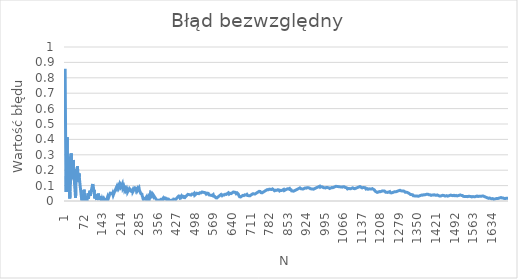
| Category | Błąd bezwzględny |
|---|---|
| 1.0 | 0.858 |
| 2.0 | 0.858 |
| 3.0 | 0.858 |
| 4.0 | 0.142 |
| 5.0 | 0.058 |
| 6.0 | 0.192 |
| 7.0 | 0.287 |
| 8.0 | 0.358 |
| 9.0 | 0.414 |
| 10.0 | 0.058 |
| 11.0 | 0.131 |
| 12.0 | 0.192 |
| 13.0 | 0.243 |
| 14.0 | 0.287 |
| 15.0 | 0.058 |
| 16.0 | 0.142 |
| 17.0 | 0.083 |
| 18.0 | 0.03 |
| 19.0 | 0.016 |
| 20.0 | 0.058 |
| 21.0 | 0.094 |
| 22.0 | 0.233 |
| 23.0 | 0.185 |
| 24.0 | 0.308 |
| 25.0 | 0.262 |
| 26.0 | 0.219 |
| 27.0 | 0.179 |
| 28.0 | 0.142 |
| 29.0 | 0.245 |
| 30.0 | 0.208 |
| 31.0 | 0.174 |
| 32.0 | 0.267 |
| 33.0 | 0.233 |
| 34.0 | 0.2 |
| 35.0 | 0.17 |
| 36.0 | 0.142 |
| 37.0 | 0.115 |
| 38.0 | 0.089 |
| 39.0 | 0.065 |
| 40.0 | 0.042 |
| 41.0 | 0.02 |
| 42.0 | 0.094 |
| 43.0 | 0.165 |
| 44.0 | 0.142 |
| 45.0 | 0.208 |
| 46.0 | 0.185 |
| 47.0 | 0.163 |
| 48.0 | 0.225 |
| 49.0 | 0.203 |
| 50.0 | 0.182 |
| 51.0 | 0.161 |
| 52.0 | 0.142 |
| 53.0 | 0.123 |
| 54.0 | 0.179 |
| 55.0 | 0.16 |
| 56.0 | 0.142 |
| 57.0 | 0.124 |
| 58.0 | 0.107 |
| 59.0 | 0.091 |
| 60.0 | 0.075 |
| 61.0 | 0.06 |
| 62.0 | 0.045 |
| 63.0 | 0.03 |
| 64.0 | 0.017 |
| 65.0 | 0.003 |
| 66.0 | 0.01 |
| 67.0 | 0.023 |
| 68.0 | 0.024 |
| 69.0 | 0.011 |
| 70.0 | 0.001 |
| 71.0 | 0.043 |
| 72.0 | 0.03 |
| 73.0 | 0.073 |
| 74.0 | 0.061 |
| 75.0 | 0.048 |
| 76.0 | 0.036 |
| 77.0 | 0.025 |
| 78.0 | 0.013 |
| 79.0 | 0.002 |
| 80.0 | 0.008 |
| 81.0 | 0.03 |
| 82.0 | 0.02 |
| 83.0 | 0.009 |
| 84.0 | 0.001 |
| 85.0 | 0.011 |
| 86.0 | 0.021 |
| 87.0 | 0.031 |
| 88.0 | 0.04 |
| 89.0 | 0.049 |
| 90.0 | 0.014 |
| 91.0 | 0.023 |
| 92.0 | 0.032 |
| 93.0 | 0.041 |
| 94.0 | 0.05 |
| 95.0 | 0.058 |
| 96.0 | 0.067 |
| 97.0 | 0.034 |
| 98.0 | 0.042 |
| 99.0 | 0.05 |
| 100.0 | 0.058 |
| 101.0 | 0.066 |
| 102.0 | 0.074 |
| 103.0 | 0.082 |
| 104.0 | 0.089 |
| 105.0 | 0.097 |
| 106.0 | 0.104 |
| 107.0 | 0.111 |
| 108.0 | 0.081 |
| 109.0 | 0.088 |
| 110.0 | 0.058 |
| 111.0 | 0.066 |
| 112.0 | 0.073 |
| 113.0 | 0.044 |
| 114.0 | 0.016 |
| 115.0 | 0.024 |
| 116.0 | 0.031 |
| 117.0 | 0.038 |
| 118.0 | 0.045 |
| 119.0 | 0.018 |
| 120.0 | 0.025 |
| 121.0 | 0.032 |
| 122.0 | 0.006 |
| 123.0 | 0.013 |
| 124.0 | 0.013 |
| 125.0 | 0.038 |
| 126.0 | 0.03 |
| 127.0 | 0.023 |
| 128.0 | 0.048 |
| 129.0 | 0.041 |
| 130.0 | 0.034 |
| 131.0 | 0.027 |
| 132.0 | 0.02 |
| 133.0 | 0.014 |
| 134.0 | 0.007 |
| 135.0 | 0.03 |
| 136.0 | 0.024 |
| 137.0 | 0.018 |
| 138.0 | 0.011 |
| 139.0 | 0.005 |
| 140.0 | 0.001 |
| 141.0 | 0.007 |
| 142.0 | 0.013 |
| 143.0 | 0.009 |
| 144.0 | 0.003 |
| 145.0 | 0.003 |
| 146.0 | 0.009 |
| 147.0 | 0.012 |
| 148.0 | 0.006 |
| 149.0 | 0.001 |
| 150.0 | 0.005 |
| 151.0 | 0.011 |
| 152.0 | 0.016 |
| 153.0 | 0.004 |
| 154.0 | 0.001 |
| 155.0 | 0.019 |
| 156.0 | 0.013 |
| 157.0 | 0.008 |
| 158.0 | 0.002 |
| 159.0 | 0.003 |
| 160.0 | 0.008 |
| 161.0 | 0.014 |
| 162.0 | 0.019 |
| 163.0 | 0.024 |
| 164.0 | 0.029 |
| 165.0 | 0.01 |
| 166.0 | 0.015 |
| 167.0 | 0.02 |
| 168.0 | 0.025 |
| 169.0 | 0.03 |
| 170.0 | 0.035 |
| 171.0 | 0.04 |
| 172.0 | 0.044 |
| 173.0 | 0.049 |
| 174.0 | 0.054 |
| 175.0 | 0.058 |
| 176.0 | 0.04 |
| 177.0 | 0.045 |
| 178.0 | 0.049 |
| 179.0 | 0.054 |
| 180.0 | 0.058 |
| 181.0 | 0.041 |
| 182.0 | 0.045 |
| 183.0 | 0.05 |
| 184.0 | 0.054 |
| 185.0 | 0.037 |
| 186.0 | 0.041 |
| 187.0 | 0.046 |
| 188.0 | 0.05 |
| 189.0 | 0.054 |
| 190.0 | 0.058 |
| 191.0 | 0.063 |
| 192.0 | 0.067 |
| 193.0 | 0.071 |
| 194.0 | 0.075 |
| 195.0 | 0.079 |
| 196.0 | 0.083 |
| 197.0 | 0.087 |
| 198.0 | 0.091 |
| 199.0 | 0.095 |
| 200.0 | 0.098 |
| 201.0 | 0.082 |
| 202.0 | 0.086 |
| 203.0 | 0.09 |
| 204.0 | 0.094 |
| 205.0 | 0.097 |
| 206.0 | 0.101 |
| 207.0 | 0.105 |
| 208.0 | 0.089 |
| 209.0 | 0.093 |
| 210.0 | 0.097 |
| 211.0 | 0.1 |
| 212.0 | 0.104 |
| 213.0 | 0.107 |
| 214.0 | 0.092 |
| 215.0 | 0.096 |
| 216.0 | 0.099 |
| 217.0 | 0.103 |
| 218.0 | 0.106 |
| 219.0 | 0.11 |
| 220.0 | 0.113 |
| 221.0 | 0.098 |
| 222.0 | 0.084 |
| 223.0 | 0.087 |
| 224.0 | 0.091 |
| 225.0 | 0.094 |
| 226.0 | 0.097 |
| 227.0 | 0.101 |
| 228.0 | 0.086 |
| 229.0 | 0.072 |
| 230.0 | 0.076 |
| 231.0 | 0.079 |
| 232.0 | 0.083 |
| 233.0 | 0.069 |
| 234.0 | 0.072 |
| 235.0 | 0.075 |
| 236.0 | 0.079 |
| 237.0 | 0.082 |
| 238.0 | 0.085 |
| 239.0 | 0.072 |
| 240.0 | 0.058 |
| 241.0 | 0.062 |
| 242.0 | 0.065 |
| 243.0 | 0.068 |
| 244.0 | 0.072 |
| 245.0 | 0.075 |
| 246.0 | 0.078 |
| 247.0 | 0.081 |
| 248.0 | 0.084 |
| 249.0 | 0.087 |
| 250.0 | 0.074 |
| 251.0 | 0.078 |
| 252.0 | 0.065 |
| 253.0 | 0.068 |
| 254.0 | 0.071 |
| 255.0 | 0.058 |
| 256.0 | 0.062 |
| 257.0 | 0.065 |
| 258.0 | 0.068 |
| 259.0 | 0.071 |
| 260.0 | 0.058 |
| 261.0 | 0.061 |
| 262.0 | 0.065 |
| 263.0 | 0.068 |
| 264.0 | 0.071 |
| 265.0 | 0.074 |
| 266.0 | 0.076 |
| 267.0 | 0.079 |
| 268.0 | 0.082 |
| 269.0 | 0.085 |
| 270.0 | 0.088 |
| 271.0 | 0.091 |
| 272.0 | 0.079 |
| 273.0 | 0.082 |
| 274.0 | 0.07 |
| 275.0 | 0.073 |
| 276.0 | 0.076 |
| 277.0 | 0.079 |
| 278.0 | 0.067 |
| 279.0 | 0.07 |
| 280.0 | 0.073 |
| 281.0 | 0.075 |
| 282.0 | 0.078 |
| 283.0 | 0.081 |
| 284.0 | 0.084 |
| 285.0 | 0.072 |
| 286.0 | 0.075 |
| 287.0 | 0.078 |
| 288.0 | 0.067 |
| 289.0 | 0.056 |
| 290.0 | 0.058 |
| 291.0 | 0.047 |
| 292.0 | 0.05 |
| 293.0 | 0.053 |
| 294.0 | 0.042 |
| 295.0 | 0.045 |
| 296.0 | 0.034 |
| 297.0 | 0.037 |
| 298.0 | 0.026 |
| 299.0 | 0.016 |
| 300.0 | 0.018 |
| 301.0 | 0.008 |
| 302.0 | 0.011 |
| 303.0 | 0.014 |
| 304.0 | 0.016 |
| 305.0 | 0.019 |
| 306.0 | 0.022 |
| 307.0 | 0.012 |
| 308.0 | 0.014 |
| 309.0 | 0.017 |
| 310.0 | 0.02 |
| 311.0 | 0.022 |
| 312.0 | 0.012 |
| 313.0 | 0.015 |
| 314.0 | 0.018 |
| 315.0 | 0.02 |
| 316.0 | 0.01 |
| 317.0 | 0.013 |
| 318.0 | 0.003 |
| 319.0 | 0.007 |
| 320.0 | 0.017 |
| 321.0 | 0.026 |
| 322.0 | 0.024 |
| 323.0 | 0.021 |
| 324.0 | 0.018 |
| 325.0 | 0.028 |
| 326.0 | 0.037 |
| 327.0 | 0.047 |
| 328.0 | 0.044 |
| 329.0 | 0.041 |
| 330.0 | 0.039 |
| 331.0 | 0.048 |
| 332.0 | 0.045 |
| 333.0 | 0.042 |
| 334.0 | 0.04 |
| 335.0 | 0.037 |
| 336.0 | 0.034 |
| 337.0 | 0.032 |
| 338.0 | 0.041 |
| 339.0 | 0.038 |
| 340.0 | 0.036 |
| 341.0 | 0.033 |
| 342.0 | 0.03 |
| 343.0 | 0.028 |
| 344.0 | 0.025 |
| 345.0 | 0.023 |
| 346.0 | 0.02 |
| 347.0 | 0.018 |
| 348.0 | 0.015 |
| 349.0 | 0.013 |
| 350.0 | 0.01 |
| 351.0 | 0.008 |
| 352.0 | 0.005 |
| 353.0 | 0.003 |
| 354.0 | 0 |
| 355.0 | 0.009 |
| 356.0 | 0.007 |
| 357.0 | 0.004 |
| 358.0 | 0.002 |
| 359.0 | 0.011 |
| 360.0 | 0.008 |
| 361.0 | 0.006 |
| 362.0 | 0.003 |
| 363.0 | 0.001 |
| 364.0 | 0.001 |
| 365.0 | 0.004 |
| 366.0 | 0.006 |
| 367.0 | 0.008 |
| 368.0 | 0.011 |
| 369.0 | 0.013 |
| 370.0 | 0.015 |
| 371.0 | 0.007 |
| 372.0 | 0.009 |
| 373.0 | 0.011 |
| 374.0 | 0.013 |
| 375.0 | 0.016 |
| 376.0 | 0.007 |
| 377.0 | 0.01 |
| 378.0 | 0.012 |
| 379.0 | 0.014 |
| 380.0 | 0.016 |
| 381.0 | 0.019 |
| 382.0 | 0.021 |
| 383.0 | 0.023 |
| 384.0 | 0.015 |
| 385.0 | 0.017 |
| 386.0 | 0.019 |
| 387.0 | 0.021 |
| 388.0 | 0.013 |
| 389.0 | 0.015 |
| 390.0 | 0.007 |
| 391.0 | 0.009 |
| 392.0 | 0.011 |
| 393.0 | 0.014 |
| 394.0 | 0.016 |
| 395.0 | 0.018 |
| 396.0 | 0.02 |
| 397.0 | 0.012 |
| 398.0 | 0.014 |
| 399.0 | 0.006 |
| 400.0 | 0.002 |
| 401.0 | 0.001 |
| 402.0 | 0.007 |
| 403.0 | 0.005 |
| 404.0 | 0.003 |
| 405.0 | 0.001 |
| 406.0 | 0.001 |
| 407.0 | 0.003 |
| 408.0 | 0.005 |
| 409.0 | 0.008 |
| 410.0 | 0.01 |
| 411.0 | 0.012 |
| 412.0 | 0.004 |
| 413.0 | 0.006 |
| 414.0 | 0.008 |
| 415.0 | 0.01 |
| 416.0 | 0.012 |
| 417.0 | 0.014 |
| 418.0 | 0.007 |
| 419.0 | 0.009 |
| 420.0 | 0.011 |
| 421.0 | 0.013 |
| 422.0 | 0.015 |
| 423.0 | 0.017 |
| 424.0 | 0.009 |
| 425.0 | 0.011 |
| 426.0 | 0.013 |
| 427.0 | 0.015 |
| 428.0 | 0.017 |
| 429.0 | 0.019 |
| 430.0 | 0.021 |
| 431.0 | 0.023 |
| 432.0 | 0.025 |
| 433.0 | 0.027 |
| 434.0 | 0.029 |
| 435.0 | 0.031 |
| 436.0 | 0.033 |
| 437.0 | 0.035 |
| 438.0 | 0.036 |
| 439.0 | 0.029 |
| 440.0 | 0.031 |
| 441.0 | 0.024 |
| 442.0 | 0.026 |
| 443.0 | 0.028 |
| 444.0 | 0.03 |
| 445.0 | 0.031 |
| 446.0 | 0.024 |
| 447.0 | 0.026 |
| 448.0 | 0.028 |
| 449.0 | 0.03 |
| 450.0 | 0.032 |
| 451.0 | 0.034 |
| 452.0 | 0.035 |
| 453.0 | 0.037 |
| 454.0 | 0.03 |
| 455.0 | 0.023 |
| 456.0 | 0.025 |
| 457.0 | 0.027 |
| 458.0 | 0.029 |
| 459.0 | 0.022 |
| 460.0 | 0.024 |
| 461.0 | 0.025 |
| 462.0 | 0.027 |
| 463.0 | 0.029 |
| 464.0 | 0.031 |
| 465.0 | 0.033 |
| 466.0 | 0.034 |
| 467.0 | 0.036 |
| 468.0 | 0.038 |
| 469.0 | 0.04 |
| 470.0 | 0.041 |
| 471.0 | 0.043 |
| 472.0 | 0.045 |
| 473.0 | 0.047 |
| 474.0 | 0.048 |
| 475.0 | 0.042 |
| 476.0 | 0.043 |
| 477.0 | 0.037 |
| 478.0 | 0.038 |
| 479.0 | 0.04 |
| 480.0 | 0.042 |
| 481.0 | 0.035 |
| 482.0 | 0.037 |
| 483.0 | 0.039 |
| 484.0 | 0.04 |
| 485.0 | 0.042 |
| 486.0 | 0.044 |
| 487.0 | 0.045 |
| 488.0 | 0.047 |
| 489.0 | 0.04 |
| 490.0 | 0.042 |
| 491.0 | 0.044 |
| 492.0 | 0.045 |
| 493.0 | 0.047 |
| 494.0 | 0.049 |
| 495.0 | 0.05 |
| 496.0 | 0.044 |
| 497.0 | 0.037 |
| 498.0 | 0.039 |
| 499.0 | 0.041 |
| 500.0 | 0.042 |
| 501.0 | 0.044 |
| 502.0 | 0.046 |
| 503.0 | 0.047 |
| 504.0 | 0.049 |
| 505.0 | 0.05 |
| 506.0 | 0.052 |
| 507.0 | 0.054 |
| 508.0 | 0.055 |
| 509.0 | 0.049 |
| 510.0 | 0.051 |
| 511.0 | 0.052 |
| 512.0 | 0.046 |
| 513.0 | 0.047 |
| 514.0 | 0.049 |
| 515.0 | 0.051 |
| 516.0 | 0.052 |
| 517.0 | 0.054 |
| 518.0 | 0.055 |
| 519.0 | 0.049 |
| 520.0 | 0.051 |
| 521.0 | 0.052 |
| 522.0 | 0.054 |
| 523.0 | 0.055 |
| 524.0 | 0.057 |
| 525.0 | 0.058 |
| 526.0 | 0.06 |
| 527.0 | 0.061 |
| 528.0 | 0.055 |
| 529.0 | 0.057 |
| 530.0 | 0.058 |
| 531.0 | 0.06 |
| 532.0 | 0.061 |
| 533.0 | 0.055 |
| 534.0 | 0.049 |
| 535.0 | 0.051 |
| 536.0 | 0.052 |
| 537.0 | 0.054 |
| 538.0 | 0.048 |
| 539.0 | 0.05 |
| 540.0 | 0.051 |
| 541.0 | 0.045 |
| 542.0 | 0.047 |
| 543.0 | 0.048 |
| 544.0 | 0.05 |
| 545.0 | 0.051 |
| 546.0 | 0.053 |
| 547.0 | 0.047 |
| 548.0 | 0.048 |
| 549.0 | 0.05 |
| 550.0 | 0.044 |
| 551.0 | 0.045 |
| 552.0 | 0.04 |
| 553.0 | 0.041 |
| 554.0 | 0.035 |
| 555.0 | 0.037 |
| 556.0 | 0.038 |
| 557.0 | 0.033 |
| 558.0 | 0.034 |
| 559.0 | 0.036 |
| 560.0 | 0.037 |
| 561.0 | 0.038 |
| 562.0 | 0.04 |
| 563.0 | 0.034 |
| 564.0 | 0.036 |
| 565.0 | 0.037 |
| 566.0 | 0.039 |
| 567.0 | 0.04 |
| 568.0 | 0.042 |
| 569.0 | 0.036 |
| 570.0 | 0.03 |
| 571.0 | 0.025 |
| 572.0 | 0.026 |
| 573.0 | 0.028 |
| 574.0 | 0.029 |
| 575.0 | 0.024 |
| 576.0 | 0.025 |
| 577.0 | 0.027 |
| 578.0 | 0.021 |
| 579.0 | 0.022 |
| 580.0 | 0.017 |
| 581.0 | 0.018 |
| 582.0 | 0.02 |
| 583.0 | 0.021 |
| 584.0 | 0.023 |
| 585.0 | 0.024 |
| 586.0 | 0.026 |
| 587.0 | 0.027 |
| 588.0 | 0.028 |
| 589.0 | 0.03 |
| 590.0 | 0.031 |
| 591.0 | 0.033 |
| 592.0 | 0.034 |
| 593.0 | 0.035 |
| 594.0 | 0.037 |
| 595.0 | 0.038 |
| 596.0 | 0.04 |
| 597.0 | 0.041 |
| 598.0 | 0.042 |
| 599.0 | 0.044 |
| 600.0 | 0.038 |
| 601.0 | 0.04 |
| 602.0 | 0.034 |
| 603.0 | 0.036 |
| 604.0 | 0.037 |
| 605.0 | 0.039 |
| 606.0 | 0.04 |
| 607.0 | 0.041 |
| 608.0 | 0.043 |
| 609.0 | 0.044 |
| 610.0 | 0.039 |
| 611.0 | 0.04 |
| 612.0 | 0.041 |
| 613.0 | 0.043 |
| 614.0 | 0.044 |
| 615.0 | 0.045 |
| 616.0 | 0.04 |
| 617.0 | 0.042 |
| 618.0 | 0.043 |
| 619.0 | 0.044 |
| 620.0 | 0.046 |
| 621.0 | 0.047 |
| 622.0 | 0.048 |
| 623.0 | 0.049 |
| 624.0 | 0.051 |
| 625.0 | 0.052 |
| 626.0 | 0.053 |
| 627.0 | 0.048 |
| 628.0 | 0.049 |
| 629.0 | 0.044 |
| 630.0 | 0.046 |
| 631.0 | 0.047 |
| 632.0 | 0.048 |
| 633.0 | 0.05 |
| 634.0 | 0.051 |
| 635.0 | 0.046 |
| 636.0 | 0.047 |
| 637.0 | 0.048 |
| 638.0 | 0.05 |
| 639.0 | 0.051 |
| 640.0 | 0.052 |
| 641.0 | 0.053 |
| 642.0 | 0.055 |
| 643.0 | 0.056 |
| 644.0 | 0.057 |
| 645.0 | 0.058 |
| 646.0 | 0.06 |
| 647.0 | 0.061 |
| 648.0 | 0.062 |
| 649.0 | 0.057 |
| 650.0 | 0.058 |
| 651.0 | 0.06 |
| 652.0 | 0.055 |
| 653.0 | 0.056 |
| 654.0 | 0.051 |
| 655.0 | 0.052 |
| 656.0 | 0.047 |
| 657.0 | 0.049 |
| 658.0 | 0.05 |
| 659.0 | 0.051 |
| 660.0 | 0.052 |
| 661.0 | 0.054 |
| 662.0 | 0.049 |
| 663.0 | 0.05 |
| 664.0 | 0.045 |
| 665.0 | 0.04 |
| 666.0 | 0.036 |
| 667.0 | 0.031 |
| 668.0 | 0.032 |
| 669.0 | 0.027 |
| 670.0 | 0.029 |
| 671.0 | 0.024 |
| 672.0 | 0.025 |
| 673.0 | 0.026 |
| 674.0 | 0.028 |
| 675.0 | 0.029 |
| 676.0 | 0.03 |
| 677.0 | 0.031 |
| 678.0 | 0.032 |
| 679.0 | 0.034 |
| 680.0 | 0.035 |
| 681.0 | 0.036 |
| 682.0 | 0.037 |
| 683.0 | 0.038 |
| 684.0 | 0.04 |
| 685.0 | 0.035 |
| 686.0 | 0.036 |
| 687.0 | 0.037 |
| 688.0 | 0.039 |
| 689.0 | 0.04 |
| 690.0 | 0.035 |
| 691.0 | 0.036 |
| 692.0 | 0.038 |
| 693.0 | 0.039 |
| 694.0 | 0.04 |
| 695.0 | 0.041 |
| 696.0 | 0.042 |
| 697.0 | 0.043 |
| 698.0 | 0.039 |
| 699.0 | 0.04 |
| 700.0 | 0.036 |
| 701.0 | 0.037 |
| 702.0 | 0.032 |
| 703.0 | 0.033 |
| 704.0 | 0.035 |
| 705.0 | 0.036 |
| 706.0 | 0.031 |
| 707.0 | 0.032 |
| 708.0 | 0.034 |
| 709.0 | 0.035 |
| 710.0 | 0.036 |
| 711.0 | 0.037 |
| 712.0 | 0.038 |
| 713.0 | 0.039 |
| 714.0 | 0.04 |
| 715.0 | 0.042 |
| 716.0 | 0.043 |
| 717.0 | 0.044 |
| 718.0 | 0.045 |
| 719.0 | 0.046 |
| 720.0 | 0.047 |
| 721.0 | 0.048 |
| 722.0 | 0.05 |
| 723.0 | 0.051 |
| 724.0 | 0.046 |
| 725.0 | 0.047 |
| 726.0 | 0.048 |
| 727.0 | 0.044 |
| 728.0 | 0.045 |
| 729.0 | 0.046 |
| 730.0 | 0.047 |
| 731.0 | 0.049 |
| 732.0 | 0.05 |
| 733.0 | 0.051 |
| 734.0 | 0.052 |
| 735.0 | 0.053 |
| 736.0 | 0.054 |
| 737.0 | 0.055 |
| 738.0 | 0.056 |
| 739.0 | 0.057 |
| 740.0 | 0.058 |
| 741.0 | 0.059 |
| 742.0 | 0.061 |
| 743.0 | 0.062 |
| 744.0 | 0.063 |
| 745.0 | 0.064 |
| 746.0 | 0.065 |
| 747.0 | 0.066 |
| 748.0 | 0.062 |
| 749.0 | 0.063 |
| 750.0 | 0.058 |
| 751.0 | 0.054 |
| 752.0 | 0.05 |
| 753.0 | 0.051 |
| 754.0 | 0.052 |
| 755.0 | 0.053 |
| 756.0 | 0.054 |
| 757.0 | 0.055 |
| 758.0 | 0.056 |
| 759.0 | 0.057 |
| 760.0 | 0.058 |
| 761.0 | 0.059 |
| 762.0 | 0.061 |
| 763.0 | 0.062 |
| 764.0 | 0.063 |
| 765.0 | 0.064 |
| 766.0 | 0.065 |
| 767.0 | 0.066 |
| 768.0 | 0.067 |
| 769.0 | 0.068 |
| 770.0 | 0.069 |
| 771.0 | 0.07 |
| 772.0 | 0.071 |
| 773.0 | 0.072 |
| 774.0 | 0.073 |
| 775.0 | 0.074 |
| 776.0 | 0.07 |
| 777.0 | 0.071 |
| 778.0 | 0.072 |
| 779.0 | 0.073 |
| 780.0 | 0.074 |
| 781.0 | 0.075 |
| 782.0 | 0.076 |
| 783.0 | 0.077 |
| 784.0 | 0.078 |
| 785.0 | 0.079 |
| 786.0 | 0.08 |
| 787.0 | 0.076 |
| 788.0 | 0.077 |
| 789.0 | 0.073 |
| 790.0 | 0.074 |
| 791.0 | 0.075 |
| 792.0 | 0.076 |
| 793.0 | 0.077 |
| 794.0 | 0.078 |
| 795.0 | 0.079 |
| 796.0 | 0.074 |
| 797.0 | 0.075 |
| 798.0 | 0.076 |
| 799.0 | 0.072 |
| 800.0 | 0.068 |
| 801.0 | 0.069 |
| 802.0 | 0.07 |
| 803.0 | 0.066 |
| 804.0 | 0.067 |
| 805.0 | 0.068 |
| 806.0 | 0.069 |
| 807.0 | 0.07 |
| 808.0 | 0.071 |
| 809.0 | 0.072 |
| 810.0 | 0.073 |
| 811.0 | 0.069 |
| 812.0 | 0.07 |
| 813.0 | 0.071 |
| 814.0 | 0.072 |
| 815.0 | 0.073 |
| 816.0 | 0.069 |
| 817.0 | 0.07 |
| 818.0 | 0.071 |
| 819.0 | 0.072 |
| 820.0 | 0.073 |
| 821.0 | 0.069 |
| 822.0 | 0.065 |
| 823.0 | 0.066 |
| 824.0 | 0.067 |
| 825.0 | 0.068 |
| 826.0 | 0.069 |
| 827.0 | 0.065 |
| 828.0 | 0.066 |
| 829.0 | 0.067 |
| 830.0 | 0.068 |
| 831.0 | 0.069 |
| 832.0 | 0.07 |
| 833.0 | 0.071 |
| 834.0 | 0.072 |
| 835.0 | 0.073 |
| 836.0 | 0.074 |
| 837.0 | 0.075 |
| 838.0 | 0.076 |
| 839.0 | 0.072 |
| 840.0 | 0.068 |
| 841.0 | 0.069 |
| 842.0 | 0.07 |
| 843.0 | 0.071 |
| 844.0 | 0.072 |
| 845.0 | 0.073 |
| 846.0 | 0.074 |
| 847.0 | 0.074 |
| 848.0 | 0.075 |
| 849.0 | 0.076 |
| 850.0 | 0.077 |
| 851.0 | 0.078 |
| 852.0 | 0.079 |
| 853.0 | 0.08 |
| 854.0 | 0.081 |
| 855.0 | 0.082 |
| 856.0 | 0.078 |
| 857.0 | 0.079 |
| 858.0 | 0.08 |
| 859.0 | 0.081 |
| 860.0 | 0.082 |
| 861.0 | 0.078 |
| 862.0 | 0.074 |
| 863.0 | 0.075 |
| 864.0 | 0.071 |
| 865.0 | 0.072 |
| 866.0 | 0.073 |
| 867.0 | 0.069 |
| 868.0 | 0.066 |
| 869.0 | 0.062 |
| 870.0 | 0.063 |
| 871.0 | 0.064 |
| 872.0 | 0.065 |
| 873.0 | 0.066 |
| 874.0 | 0.067 |
| 875.0 | 0.068 |
| 876.0 | 0.064 |
| 877.0 | 0.065 |
| 878.0 | 0.066 |
| 879.0 | 0.067 |
| 880.0 | 0.067 |
| 881.0 | 0.068 |
| 882.0 | 0.069 |
| 883.0 | 0.07 |
| 884.0 | 0.071 |
| 885.0 | 0.072 |
| 886.0 | 0.073 |
| 887.0 | 0.074 |
| 888.0 | 0.075 |
| 889.0 | 0.076 |
| 890.0 | 0.076 |
| 891.0 | 0.077 |
| 892.0 | 0.078 |
| 893.0 | 0.079 |
| 894.0 | 0.08 |
| 895.0 | 0.081 |
| 896.0 | 0.082 |
| 897.0 | 0.082 |
| 898.0 | 0.083 |
| 899.0 | 0.084 |
| 900.0 | 0.085 |
| 901.0 | 0.086 |
| 902.0 | 0.082 |
| 903.0 | 0.083 |
| 904.0 | 0.08 |
| 905.0 | 0.081 |
| 906.0 | 0.077 |
| 907.0 | 0.078 |
| 908.0 | 0.079 |
| 909.0 | 0.08 |
| 910.0 | 0.076 |
| 911.0 | 0.077 |
| 912.0 | 0.078 |
| 913.0 | 0.079 |
| 914.0 | 0.079 |
| 915.0 | 0.08 |
| 916.0 | 0.081 |
| 917.0 | 0.082 |
| 918.0 | 0.083 |
| 919.0 | 0.084 |
| 920.0 | 0.084 |
| 921.0 | 0.085 |
| 922.0 | 0.086 |
| 923.0 | 0.083 |
| 924.0 | 0.084 |
| 925.0 | 0.084 |
| 926.0 | 0.085 |
| 927.0 | 0.086 |
| 928.0 | 0.087 |
| 929.0 | 0.088 |
| 930.0 | 0.089 |
| 931.0 | 0.085 |
| 932.0 | 0.086 |
| 933.0 | 0.082 |
| 934.0 | 0.083 |
| 935.0 | 0.084 |
| 936.0 | 0.085 |
| 937.0 | 0.081 |
| 938.0 | 0.082 |
| 939.0 | 0.079 |
| 940.0 | 0.08 |
| 941.0 | 0.081 |
| 942.0 | 0.081 |
| 943.0 | 0.082 |
| 944.0 | 0.079 |
| 945.0 | 0.075 |
| 946.0 | 0.076 |
| 947.0 | 0.077 |
| 948.0 | 0.078 |
| 949.0 | 0.074 |
| 950.0 | 0.075 |
| 951.0 | 0.076 |
| 952.0 | 0.077 |
| 953.0 | 0.078 |
| 954.0 | 0.079 |
| 955.0 | 0.079 |
| 956.0 | 0.08 |
| 957.0 | 0.081 |
| 958.0 | 0.082 |
| 959.0 | 0.083 |
| 960.0 | 0.083 |
| 961.0 | 0.084 |
| 962.0 | 0.085 |
| 963.0 | 0.086 |
| 964.0 | 0.087 |
| 965.0 | 0.087 |
| 966.0 | 0.088 |
| 967.0 | 0.089 |
| 968.0 | 0.09 |
| 969.0 | 0.091 |
| 970.0 | 0.091 |
| 971.0 | 0.092 |
| 972.0 | 0.093 |
| 973.0 | 0.094 |
| 974.0 | 0.095 |
| 975.0 | 0.095 |
| 976.0 | 0.096 |
| 977.0 | 0.093 |
| 978.0 | 0.089 |
| 979.0 | 0.09 |
| 980.0 | 0.091 |
| 981.0 | 0.092 |
| 982.0 | 0.093 |
| 983.0 | 0.093 |
| 984.0 | 0.094 |
| 985.0 | 0.091 |
| 986.0 | 0.092 |
| 987.0 | 0.092 |
| 988.0 | 0.089 |
| 989.0 | 0.09 |
| 990.0 | 0.087 |
| 991.0 | 0.087 |
| 992.0 | 0.088 |
| 993.0 | 0.085 |
| 994.0 | 0.086 |
| 995.0 | 0.087 |
| 996.0 | 0.087 |
| 997.0 | 0.084 |
| 998.0 | 0.085 |
| 999.0 | 0.086 |
| 1000.0 | 0.086 |
| 1001.0 | 0.087 |
| 1002.0 | 0.088 |
| 1003.0 | 0.089 |
| 1004.0 | 0.085 |
| 1005.0 | 0.086 |
| 1006.0 | 0.087 |
| 1007.0 | 0.088 |
| 1008.0 | 0.085 |
| 1009.0 | 0.085 |
| 1010.0 | 0.086 |
| 1011.0 | 0.087 |
| 1012.0 | 0.084 |
| 1013.0 | 0.084 |
| 1014.0 | 0.081 |
| 1015.0 | 0.082 |
| 1016.0 | 0.083 |
| 1017.0 | 0.084 |
| 1018.0 | 0.084 |
| 1019.0 | 0.085 |
| 1020.0 | 0.086 |
| 1021.0 | 0.087 |
| 1022.0 | 0.087 |
| 1023.0 | 0.088 |
| 1024.0 | 0.089 |
| 1025.0 | 0.086 |
| 1026.0 | 0.086 |
| 1027.0 | 0.087 |
| 1028.0 | 0.088 |
| 1029.0 | 0.089 |
| 1030.0 | 0.089 |
| 1031.0 | 0.09 |
| 1032.0 | 0.091 |
| 1033.0 | 0.092 |
| 1034.0 | 0.092 |
| 1035.0 | 0.093 |
| 1036.0 | 0.094 |
| 1037.0 | 0.095 |
| 1038.0 | 0.095 |
| 1039.0 | 0.096 |
| 1040.0 | 0.097 |
| 1041.0 | 0.098 |
| 1042.0 | 0.094 |
| 1043.0 | 0.095 |
| 1044.0 | 0.092 |
| 1045.0 | 0.093 |
| 1046.0 | 0.094 |
| 1047.0 | 0.09 |
| 1048.0 | 0.091 |
| 1049.0 | 0.092 |
| 1050.0 | 0.093 |
| 1051.0 | 0.093 |
| 1052.0 | 0.094 |
| 1053.0 | 0.091 |
| 1054.0 | 0.092 |
| 1055.0 | 0.093 |
| 1056.0 | 0.093 |
| 1057.0 | 0.09 |
| 1058.0 | 0.091 |
| 1059.0 | 0.088 |
| 1060.0 | 0.089 |
| 1061.0 | 0.089 |
| 1062.0 | 0.09 |
| 1063.0 | 0.091 |
| 1064.0 | 0.091 |
| 1065.0 | 0.092 |
| 1066.0 | 0.093 |
| 1067.0 | 0.094 |
| 1068.0 | 0.094 |
| 1069.0 | 0.091 |
| 1070.0 | 0.092 |
| 1071.0 | 0.093 |
| 1072.0 | 0.093 |
| 1073.0 | 0.09 |
| 1074.0 | 0.087 |
| 1075.0 | 0.088 |
| 1076.0 | 0.089 |
| 1077.0 | 0.086 |
| 1078.0 | 0.087 |
| 1079.0 | 0.084 |
| 1080.0 | 0.081 |
| 1081.0 | 0.081 |
| 1082.0 | 0.078 |
| 1083.0 | 0.079 |
| 1084.0 | 0.08 |
| 1085.0 | 0.081 |
| 1086.0 | 0.081 |
| 1087.0 | 0.078 |
| 1088.0 | 0.079 |
| 1089.0 | 0.08 |
| 1090.0 | 0.08 |
| 1091.0 | 0.081 |
| 1092.0 | 0.082 |
| 1093.0 | 0.083 |
| 1094.0 | 0.08 |
| 1095.0 | 0.08 |
| 1096.0 | 0.081 |
| 1097.0 | 0.082 |
| 1098.0 | 0.082 |
| 1099.0 | 0.083 |
| 1100.0 | 0.084 |
| 1101.0 | 0.085 |
| 1102.0 | 0.085 |
| 1103.0 | 0.086 |
| 1104.0 | 0.083 |
| 1105.0 | 0.08 |
| 1106.0 | 0.081 |
| 1107.0 | 0.082 |
| 1108.0 | 0.082 |
| 1109.0 | 0.083 |
| 1110.0 | 0.08 |
| 1111.0 | 0.081 |
| 1112.0 | 0.081 |
| 1113.0 | 0.082 |
| 1114.0 | 0.083 |
| 1115.0 | 0.084 |
| 1116.0 | 0.084 |
| 1117.0 | 0.085 |
| 1118.0 | 0.086 |
| 1119.0 | 0.086 |
| 1120.0 | 0.087 |
| 1121.0 | 0.088 |
| 1122.0 | 0.088 |
| 1123.0 | 0.089 |
| 1124.0 | 0.09 |
| 1125.0 | 0.09 |
| 1126.0 | 0.091 |
| 1127.0 | 0.092 |
| 1128.0 | 0.092 |
| 1129.0 | 0.093 |
| 1130.0 | 0.094 |
| 1131.0 | 0.091 |
| 1132.0 | 0.092 |
| 1133.0 | 0.092 |
| 1134.0 | 0.089 |
| 1135.0 | 0.09 |
| 1136.0 | 0.087 |
| 1137.0 | 0.088 |
| 1138.0 | 0.085 |
| 1139.0 | 0.086 |
| 1140.0 | 0.086 |
| 1141.0 | 0.087 |
| 1142.0 | 0.088 |
| 1143.0 | 0.085 |
| 1144.0 | 0.086 |
| 1145.0 | 0.086 |
| 1146.0 | 0.087 |
| 1147.0 | 0.088 |
| 1148.0 | 0.088 |
| 1149.0 | 0.086 |
| 1150.0 | 0.086 |
| 1151.0 | 0.083 |
| 1152.0 | 0.081 |
| 1153.0 | 0.078 |
| 1154.0 | 0.079 |
| 1155.0 | 0.079 |
| 1156.0 | 0.08 |
| 1157.0 | 0.081 |
| 1158.0 | 0.081 |
| 1159.0 | 0.078 |
| 1160.0 | 0.079 |
| 1161.0 | 0.076 |
| 1162.0 | 0.077 |
| 1163.0 | 0.078 |
| 1164.0 | 0.078 |
| 1165.0 | 0.079 |
| 1166.0 | 0.076 |
| 1167.0 | 0.077 |
| 1168.0 | 0.078 |
| 1169.0 | 0.078 |
| 1170.0 | 0.079 |
| 1171.0 | 0.076 |
| 1172.0 | 0.077 |
| 1173.0 | 0.078 |
| 1174.0 | 0.078 |
| 1175.0 | 0.079 |
| 1176.0 | 0.079 |
| 1177.0 | 0.08 |
| 1178.0 | 0.077 |
| 1179.0 | 0.075 |
| 1180.0 | 0.075 |
| 1181.0 | 0.076 |
| 1182.0 | 0.077 |
| 1183.0 | 0.077 |
| 1184.0 | 0.075 |
| 1185.0 | 0.072 |
| 1186.0 | 0.069 |
| 1187.0 | 0.066 |
| 1188.0 | 0.064 |
| 1189.0 | 0.061 |
| 1190.0 | 0.058 |
| 1191.0 | 0.059 |
| 1192.0 | 0.06 |
| 1193.0 | 0.057 |
| 1194.0 | 0.058 |
| 1195.0 | 0.055 |
| 1196.0 | 0.056 |
| 1197.0 | 0.056 |
| 1198.0 | 0.057 |
| 1199.0 | 0.058 |
| 1200.0 | 0.058 |
| 1201.0 | 0.059 |
| 1202.0 | 0.06 |
| 1203.0 | 0.06 |
| 1204.0 | 0.061 |
| 1205.0 | 0.062 |
| 1206.0 | 0.059 |
| 1207.0 | 0.06 |
| 1208.0 | 0.06 |
| 1209.0 | 0.061 |
| 1210.0 | 0.062 |
| 1211.0 | 0.062 |
| 1212.0 | 0.063 |
| 1213.0 | 0.064 |
| 1214.0 | 0.064 |
| 1215.0 | 0.065 |
| 1216.0 | 0.066 |
| 1217.0 | 0.066 |
| 1218.0 | 0.067 |
| 1219.0 | 0.064 |
| 1220.0 | 0.065 |
| 1221.0 | 0.066 |
| 1222.0 | 0.066 |
| 1223.0 | 0.064 |
| 1224.0 | 0.064 |
| 1225.0 | 0.062 |
| 1226.0 | 0.059 |
| 1227.0 | 0.06 |
| 1228.0 | 0.057 |
| 1229.0 | 0.058 |
| 1230.0 | 0.058 |
| 1231.0 | 0.056 |
| 1232.0 | 0.056 |
| 1233.0 | 0.057 |
| 1234.0 | 0.058 |
| 1235.0 | 0.058 |
| 1236.0 | 0.056 |
| 1237.0 | 0.056 |
| 1238.0 | 0.057 |
| 1239.0 | 0.058 |
| 1240.0 | 0.058 |
| 1241.0 | 0.059 |
| 1242.0 | 0.06 |
| 1243.0 | 0.06 |
| 1244.0 | 0.061 |
| 1245.0 | 0.058 |
| 1246.0 | 0.056 |
| 1247.0 | 0.053 |
| 1248.0 | 0.054 |
| 1249.0 | 0.055 |
| 1250.0 | 0.055 |
| 1251.0 | 0.053 |
| 1252.0 | 0.053 |
| 1253.0 | 0.054 |
| 1254.0 | 0.055 |
| 1255.0 | 0.055 |
| 1256.0 | 0.056 |
| 1257.0 | 0.056 |
| 1258.0 | 0.057 |
| 1259.0 | 0.058 |
| 1260.0 | 0.058 |
| 1261.0 | 0.059 |
| 1262.0 | 0.06 |
| 1263.0 | 0.06 |
| 1264.0 | 0.061 |
| 1265.0 | 0.062 |
| 1266.0 | 0.059 |
| 1267.0 | 0.06 |
| 1268.0 | 0.06 |
| 1269.0 | 0.061 |
| 1270.0 | 0.062 |
| 1271.0 | 0.062 |
| 1272.0 | 0.063 |
| 1273.0 | 0.063 |
| 1274.0 | 0.064 |
| 1275.0 | 0.065 |
| 1276.0 | 0.065 |
| 1277.0 | 0.066 |
| 1278.0 | 0.067 |
| 1279.0 | 0.067 |
| 1280.0 | 0.068 |
| 1281.0 | 0.068 |
| 1282.0 | 0.069 |
| 1283.0 | 0.07 |
| 1284.0 | 0.067 |
| 1285.0 | 0.065 |
| 1286.0 | 0.065 |
| 1287.0 | 0.066 |
| 1288.0 | 0.066 |
| 1289.0 | 0.067 |
| 1290.0 | 0.065 |
| 1291.0 | 0.065 |
| 1292.0 | 0.066 |
| 1293.0 | 0.066 |
| 1294.0 | 0.064 |
| 1295.0 | 0.065 |
| 1296.0 | 0.065 |
| 1297.0 | 0.066 |
| 1298.0 | 0.063 |
| 1299.0 | 0.064 |
| 1300.0 | 0.061 |
| 1301.0 | 0.059 |
| 1302.0 | 0.06 |
| 1303.0 | 0.057 |
| 1304.0 | 0.058 |
| 1305.0 | 0.055 |
| 1306.0 | 0.056 |
| 1307.0 | 0.057 |
| 1308.0 | 0.057 |
| 1309.0 | 0.055 |
| 1310.0 | 0.055 |
| 1311.0 | 0.056 |
| 1312.0 | 0.054 |
| 1313.0 | 0.054 |
| 1314.0 | 0.055 |
| 1315.0 | 0.052 |
| 1316.0 | 0.053 |
| 1317.0 | 0.054 |
| 1318.0 | 0.051 |
| 1319.0 | 0.049 |
| 1320.0 | 0.046 |
| 1321.0 | 0.044 |
| 1322.0 | 0.044 |
| 1323.0 | 0.042 |
| 1324.0 | 0.043 |
| 1325.0 | 0.043 |
| 1326.0 | 0.044 |
| 1327.0 | 0.042 |
| 1328.0 | 0.042 |
| 1329.0 | 0.043 |
| 1330.0 | 0.04 |
| 1331.0 | 0.041 |
| 1332.0 | 0.039 |
| 1333.0 | 0.036 |
| 1334.0 | 0.034 |
| 1335.0 | 0.034 |
| 1336.0 | 0.035 |
| 1337.0 | 0.036 |
| 1338.0 | 0.033 |
| 1339.0 | 0.031 |
| 1340.0 | 0.032 |
| 1341.0 | 0.032 |
| 1342.0 | 0.033 |
| 1343.0 | 0.03 |
| 1344.0 | 0.031 |
| 1345.0 | 0.032 |
| 1346.0 | 0.032 |
| 1347.0 | 0.033 |
| 1348.0 | 0.033 |
| 1349.0 | 0.034 |
| 1350.0 | 0.032 |
| 1351.0 | 0.029 |
| 1352.0 | 0.03 |
| 1353.0 | 0.031 |
| 1354.0 | 0.031 |
| 1355.0 | 0.032 |
| 1356.0 | 0.032 |
| 1357.0 | 0.033 |
| 1358.0 | 0.034 |
| 1359.0 | 0.034 |
| 1360.0 | 0.035 |
| 1361.0 | 0.035 |
| 1362.0 | 0.036 |
| 1363.0 | 0.037 |
| 1364.0 | 0.037 |
| 1365.0 | 0.038 |
| 1366.0 | 0.038 |
| 1367.0 | 0.039 |
| 1368.0 | 0.037 |
| 1369.0 | 0.037 |
| 1370.0 | 0.038 |
| 1371.0 | 0.039 |
| 1372.0 | 0.039 |
| 1373.0 | 0.04 |
| 1374.0 | 0.04 |
| 1375.0 | 0.041 |
| 1376.0 | 0.042 |
| 1377.0 | 0.039 |
| 1378.0 | 0.04 |
| 1379.0 | 0.04 |
| 1380.0 | 0.041 |
| 1381.0 | 0.042 |
| 1382.0 | 0.042 |
| 1383.0 | 0.043 |
| 1384.0 | 0.043 |
| 1385.0 | 0.044 |
| 1386.0 | 0.045 |
| 1387.0 | 0.045 |
| 1388.0 | 0.043 |
| 1389.0 | 0.043 |
| 1390.0 | 0.044 |
| 1391.0 | 0.042 |
| 1392.0 | 0.042 |
| 1393.0 | 0.04 |
| 1394.0 | 0.041 |
| 1395.0 | 0.038 |
| 1396.0 | 0.039 |
| 1397.0 | 0.04 |
| 1398.0 | 0.04 |
| 1399.0 | 0.038 |
| 1400.0 | 0.038 |
| 1401.0 | 0.039 |
| 1402.0 | 0.037 |
| 1403.0 | 0.037 |
| 1404.0 | 0.038 |
| 1405.0 | 0.038 |
| 1406.0 | 0.039 |
| 1407.0 | 0.037 |
| 1408.0 | 0.037 |
| 1409.0 | 0.038 |
| 1410.0 | 0.039 |
| 1411.0 | 0.039 |
| 1412.0 | 0.04 |
| 1413.0 | 0.04 |
| 1414.0 | 0.041 |
| 1415.0 | 0.039 |
| 1416.0 | 0.039 |
| 1417.0 | 0.037 |
| 1418.0 | 0.038 |
| 1419.0 | 0.038 |
| 1420.0 | 0.039 |
| 1421.0 | 0.036 |
| 1422.0 | 0.037 |
| 1423.0 | 0.038 |
| 1424.0 | 0.038 |
| 1425.0 | 0.039 |
| 1426.0 | 0.039 |
| 1427.0 | 0.037 |
| 1428.0 | 0.038 |
| 1429.0 | 0.035 |
| 1430.0 | 0.036 |
| 1431.0 | 0.037 |
| 1432.0 | 0.034 |
| 1433.0 | 0.035 |
| 1434.0 | 0.033 |
| 1435.0 | 0.033 |
| 1436.0 | 0.034 |
| 1437.0 | 0.034 |
| 1438.0 | 0.032 |
| 1439.0 | 0.033 |
| 1440.0 | 0.033 |
| 1441.0 | 0.034 |
| 1442.0 | 0.035 |
| 1443.0 | 0.035 |
| 1444.0 | 0.036 |
| 1445.0 | 0.036 |
| 1446.0 | 0.037 |
| 1447.0 | 0.037 |
| 1448.0 | 0.038 |
| 1449.0 | 0.039 |
| 1450.0 | 0.036 |
| 1451.0 | 0.034 |
| 1452.0 | 0.035 |
| 1453.0 | 0.033 |
| 1454.0 | 0.033 |
| 1455.0 | 0.034 |
| 1456.0 | 0.034 |
| 1457.0 | 0.032 |
| 1458.0 | 0.033 |
| 1459.0 | 0.033 |
| 1460.0 | 0.034 |
| 1461.0 | 0.034 |
| 1462.0 | 0.035 |
| 1463.0 | 0.033 |
| 1464.0 | 0.031 |
| 1465.0 | 0.031 |
| 1466.0 | 0.032 |
| 1467.0 | 0.032 |
| 1468.0 | 0.033 |
| 1469.0 | 0.033 |
| 1470.0 | 0.034 |
| 1471.0 | 0.034 |
| 1472.0 | 0.035 |
| 1473.0 | 0.036 |
| 1474.0 | 0.036 |
| 1475.0 | 0.037 |
| 1476.0 | 0.037 |
| 1477.0 | 0.038 |
| 1478.0 | 0.038 |
| 1479.0 | 0.039 |
| 1480.0 | 0.037 |
| 1481.0 | 0.037 |
| 1482.0 | 0.035 |
| 1483.0 | 0.036 |
| 1484.0 | 0.036 |
| 1485.0 | 0.037 |
| 1486.0 | 0.035 |
| 1487.0 | 0.035 |
| 1488.0 | 0.036 |
| 1489.0 | 0.036 |
| 1490.0 | 0.037 |
| 1491.0 | 0.037 |
| 1492.0 | 0.035 |
| 1493.0 | 0.033 |
| 1494.0 | 0.034 |
| 1495.0 | 0.034 |
| 1496.0 | 0.035 |
| 1497.0 | 0.035 |
| 1498.0 | 0.036 |
| 1499.0 | 0.037 |
| 1500.0 | 0.034 |
| 1501.0 | 0.032 |
| 1502.0 | 0.033 |
| 1503.0 | 0.033 |
| 1504.0 | 0.034 |
| 1505.0 | 0.034 |
| 1506.0 | 0.035 |
| 1507.0 | 0.036 |
| 1508.0 | 0.036 |
| 1509.0 | 0.037 |
| 1510.0 | 0.037 |
| 1511.0 | 0.038 |
| 1512.0 | 0.038 |
| 1513.0 | 0.039 |
| 1514.0 | 0.039 |
| 1515.0 | 0.037 |
| 1516.0 | 0.035 |
| 1517.0 | 0.036 |
| 1518.0 | 0.036 |
| 1519.0 | 0.037 |
| 1520.0 | 0.035 |
| 1521.0 | 0.035 |
| 1522.0 | 0.036 |
| 1523.0 | 0.034 |
| 1524.0 | 0.032 |
| 1525.0 | 0.032 |
| 1526.0 | 0.03 |
| 1527.0 | 0.031 |
| 1528.0 | 0.029 |
| 1529.0 | 0.029 |
| 1530.0 | 0.03 |
| 1531.0 | 0.03 |
| 1532.0 | 0.031 |
| 1533.0 | 0.029 |
| 1534.0 | 0.029 |
| 1535.0 | 0.027 |
| 1536.0 | 0.028 |
| 1537.0 | 0.028 |
| 1538.0 | 0.029 |
| 1539.0 | 0.027 |
| 1540.0 | 0.027 |
| 1541.0 | 0.028 |
| 1542.0 | 0.028 |
| 1543.0 | 0.029 |
| 1544.0 | 0.029 |
| 1545.0 | 0.03 |
| 1546.0 | 0.03 |
| 1547.0 | 0.031 |
| 1548.0 | 0.029 |
| 1549.0 | 0.029 |
| 1550.0 | 0.03 |
| 1551.0 | 0.031 |
| 1552.0 | 0.031 |
| 1553.0 | 0.032 |
| 1554.0 | 0.03 |
| 1555.0 | 0.028 |
| 1556.0 | 0.028 |
| 1557.0 | 0.029 |
| 1558.0 | 0.027 |
| 1559.0 | 0.027 |
| 1560.0 | 0.028 |
| 1561.0 | 0.028 |
| 1562.0 | 0.029 |
| 1563.0 | 0.029 |
| 1564.0 | 0.03 |
| 1565.0 | 0.03 |
| 1566.0 | 0.028 |
| 1567.0 | 0.029 |
| 1568.0 | 0.029 |
| 1569.0 | 0.027 |
| 1570.0 | 0.028 |
| 1571.0 | 0.028 |
| 1572.0 | 0.029 |
| 1573.0 | 0.029 |
| 1574.0 | 0.03 |
| 1575.0 | 0.03 |
| 1576.0 | 0.031 |
| 1577.0 | 0.032 |
| 1578.0 | 0.032 |
| 1579.0 | 0.03 |
| 1580.0 | 0.028 |
| 1581.0 | 0.029 |
| 1582.0 | 0.029 |
| 1583.0 | 0.03 |
| 1584.0 | 0.03 |
| 1585.0 | 0.031 |
| 1586.0 | 0.031 |
| 1587.0 | 0.029 |
| 1588.0 | 0.03 |
| 1589.0 | 0.03 |
| 1590.0 | 0.031 |
| 1591.0 | 0.031 |
| 1592.0 | 0.029 |
| 1593.0 | 0.03 |
| 1594.0 | 0.03 |
| 1595.0 | 0.031 |
| 1596.0 | 0.031 |
| 1597.0 | 0.032 |
| 1598.0 | 0.032 |
| 1599.0 | 0.033 |
| 1600.0 | 0.031 |
| 1601.0 | 0.031 |
| 1602.0 | 0.032 |
| 1603.0 | 0.03 |
| 1604.0 | 0.028 |
| 1605.0 | 0.029 |
| 1606.0 | 0.029 |
| 1607.0 | 0.027 |
| 1608.0 | 0.025 |
| 1609.0 | 0.026 |
| 1610.0 | 0.026 |
| 1611.0 | 0.024 |
| 1612.0 | 0.022 |
| 1613.0 | 0.023 |
| 1614.0 | 0.023 |
| 1615.0 | 0.024 |
| 1616.0 | 0.022 |
| 1617.0 | 0.022 |
| 1618.0 | 0.02 |
| 1619.0 | 0.018 |
| 1620.0 | 0.016 |
| 1621.0 | 0.017 |
| 1622.0 | 0.017 |
| 1623.0 | 0.018 |
| 1624.0 | 0.019 |
| 1625.0 | 0.019 |
| 1626.0 | 0.02 |
| 1627.0 | 0.018 |
| 1628.0 | 0.018 |
| 1629.0 | 0.016 |
| 1630.0 | 0.017 |
| 1631.0 | 0.015 |
| 1632.0 | 0.015 |
| 1633.0 | 0.013 |
| 1634.0 | 0.014 |
| 1635.0 | 0.014 |
| 1636.0 | 0.015 |
| 1637.0 | 0.015 |
| 1638.0 | 0.016 |
| 1639.0 | 0.014 |
| 1640.0 | 0.012 |
| 1641.0 | 0.013 |
| 1642.0 | 0.011 |
| 1643.0 | 0.011 |
| 1644.0 | 0.012 |
| 1645.0 | 0.012 |
| 1646.0 | 0.013 |
| 1647.0 | 0.013 |
| 1648.0 | 0.014 |
| 1649.0 | 0.014 |
| 1650.0 | 0.015 |
| 1651.0 | 0.015 |
| 1652.0 | 0.016 |
| 1653.0 | 0.016 |
| 1654.0 | 0.017 |
| 1655.0 | 0.017 |
| 1656.0 | 0.015 |
| 1657.0 | 0.016 |
| 1658.0 | 0.016 |
| 1659.0 | 0.017 |
| 1660.0 | 0.017 |
| 1661.0 | 0.018 |
| 1662.0 | 0.018 |
| 1663.0 | 0.019 |
| 1664.0 | 0.019 |
| 1665.0 | 0.02 |
| 1666.0 | 0.02 |
| 1667.0 | 0.021 |
| 1668.0 | 0.021 |
| 1669.0 | 0.022 |
| 1670.0 | 0.022 |
| 1671.0 | 0.021 |
| 1672.0 | 0.021 |
| 1673.0 | 0.022 |
| 1674.0 | 0.02 |
| 1675.0 | 0.02 |
| 1676.0 | 0.021 |
| 1677.0 | 0.021 |
| 1678.0 | 0.019 |
| 1679.0 | 0.02 |
| 1680.0 | 0.02 |
| 1681.0 | 0.018 |
| 1682.0 | 0.017 |
| 1683.0 | 0.017 |
| 1684.0 | 0.018 |
| 1685.0 | 0.016 |
| 1686.0 | 0.016 |
| 1687.0 | 0.017 |
| 1688.0 | 0.017 |
| 1689.0 | 0.018 |
| 1690.0 | 0.018 |
| 1691.0 | 0.019 |
| 1692.0 | 0.017 |
| 1693.0 | 0.017 |
| 1694.0 | 0.018 |
| 1695.0 | 0.018 |
| 1696.0 | 0.016 |
| 1697.0 | 0.017 |
| 1698.0 | 0.017 |
| 1699.0 | 0.018 |
| 1700.0 | 0.018 |